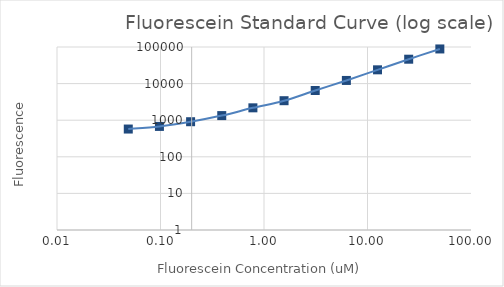
| Category | Series 1 |
|---|---|
| 50.0 | 88434.75 |
| 25.0 | 46409.25 |
| 12.5 | 23787.75 |
| 6.25 | 12197.25 |
| 3.125 | 6486.5 |
| 1.5625 | 3410 |
| 0.78125 | 2177.75 |
| 0.390625 | 1336.5 |
| 0.1953125 | 908.75 |
| 0.09765625 | 676.25 |
| 0.048828125 | 573.5 |